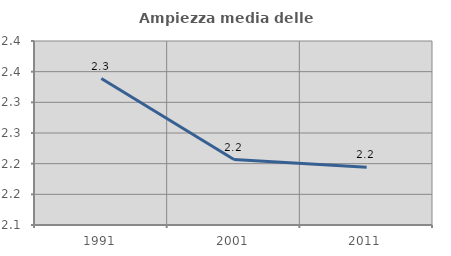
| Category | Ampiezza media delle famiglie |
|---|---|
| 1991.0 | 2.339 |
| 2001.0 | 2.207 |
| 2011.0 | 2.194 |